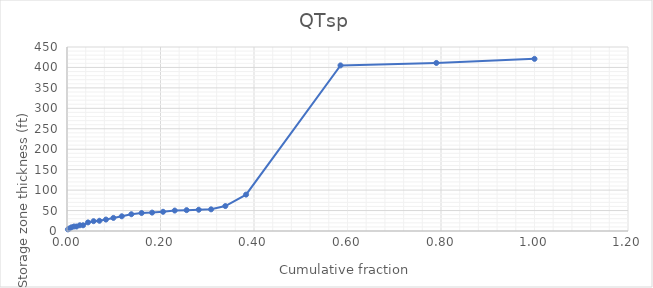
| Category | Series 0 |
|---|---|
| 0.00199501246882793 | 4 |
| 0.004987531172069825 | 6 |
| 0.00947630922693267 | 9 |
| 0.014962593516209478 | 11 |
| 0.020448877805486286 | 11 |
| 0.027431421446384042 | 14 |
| 0.0344139650872818 | 14 |
| 0.04488778054862843 | 21 |
| 0.05685785536159601 | 24 |
| 0.06932668329177058 | 25 |
| 0.0832917705735661 | 28 |
| 0.09925187032418954 | 32 |
| 0.11720698254364091 | 36 |
| 0.1376558603491272 | 41 |
| 0.1596009975062344 | 44 |
| 0.18204488778054861 | 45 |
| 0.2054862842892768 | 47 |
| 0.23042394014962592 | 50 |
| 0.25586034912718203 | 51 |
| 0.2817955112219451 | 52 |
| 0.3082294264339152 | 53 |
| 0.33865336658354117 | 61 |
| 0.3830423940149626 | 89 |
| 0.5850374064837905 | 405 |
| 0.7900249376558603 | 411 |
| 1.0 | 421 |